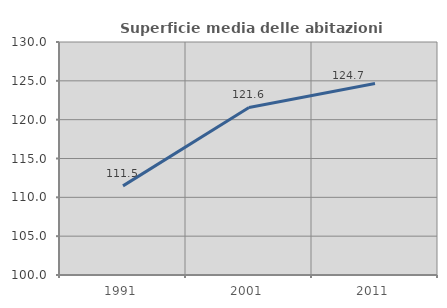
| Category | Superficie media delle abitazioni occupate |
|---|---|
| 1991.0 | 111.476 |
| 2001.0 | 121.57 |
| 2011.0 | 124.665 |